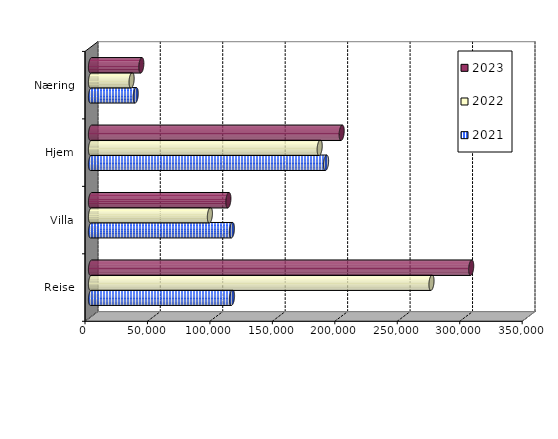
| Category | 2021 | 2022 | 2023 |
|---|---|---|---|
| Reise | 112892.846 | 272587 | 304371.779 |
| Villa | 112820.346 | 95185.337 | 109980.073 |
| Hjem | 188188.29 | 183082.731 | 200684.662 |
| Næring | 35814.895 | 32504.417 | 40282.891 |